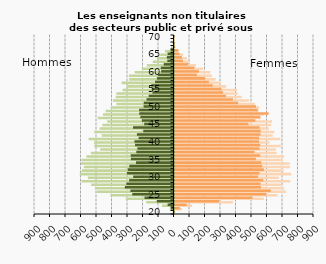
| Category | Femmes public | Femmes privé |
|---|---|---|
| 20.0 | 5 | 2 |
| 21.0 | 49 | 35 |
| 22.0 | 114 | 79 |
| 23.0 | 377 | 287 |
| 24.0 | 576 | 503 |
| 25.0 | 664 | 592 |
| 26.0 | 720 | 621 |
| 27.0 | 708 | 558 |
| 28.0 | 695 | 555 |
| 29.0 | 747 | 573 |
| 30.0 | 674 | 539 |
| 31.0 | 753 | 548 |
| 32.0 | 704 | 576 |
| 33.0 | 745 | 566 |
| 34.0 | 743 | 560 |
| 35.0 | 700 | 525 |
| 36.0 | 707 | 553 |
| 37.0 | 659 | 516 |
| 38.0 | 654 | 549 |
| 39.0 | 686 | 553 |
| 40.0 | 613 | 545 |
| 41.0 | 683 | 546 |
| 42.0 | 634 | 555 |
| 43.0 | 644 | 557 |
| 44.0 | 609 | 549 |
| 45.0 | 624 | 477 |
| 46.0 | 629 | 522 |
| 47.0 | 556 | 553 |
| 48.0 | 575 | 608 |
| 49.0 | 541 | 538 |
| 50.0 | 547 | 526 |
| 51.0 | 518 | 410 |
| 52.0 | 480 | 377 |
| 53.0 | 434 | 332 |
| 54.0 | 407 | 313 |
| 55.0 | 402 | 303 |
| 56.0 | 333 | 247 |
| 57.0 | 297 | 222 |
| 58.0 | 266 | 198 |
| 59.0 | 241 | 145 |
| 60.0 | 230 | 158 |
| 61.0 | 184 | 128 |
| 62.0 | 139 | 88 |
| 63.0 | 98 | 55 |
| 64.0 | 80 | 48 |
| 65.0 | 56 | 32 |
| 66.0 | 25 | 25 |
| 67.0 | 6 | 4 |
| 68.0 | 2 | 1 |
| 69.0 | 2 | 2 |
| 70.0 | 0 | 1 |